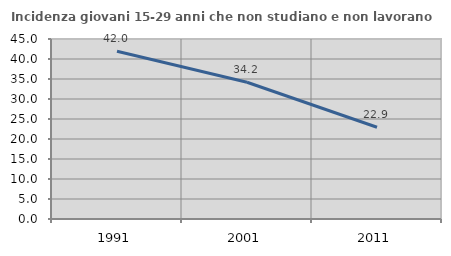
| Category | Incidenza giovani 15-29 anni che non studiano e non lavorano  |
|---|---|
| 1991.0 | 41.954 |
| 2001.0 | 34.177 |
| 2011.0 | 22.941 |